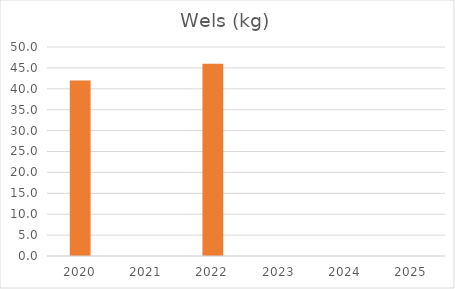
| Category | Wels (kg) |
|---|---|
| 2020.0 | 42 |
| 2021.0 | 0 |
| 2022.0 | 46 |
| 2023.0 | 0 |
| 2024.0 | 0 |
| 2025.0 | 0 |